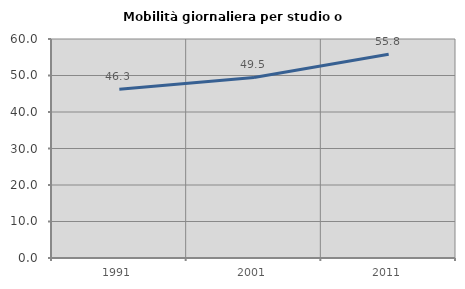
| Category | Mobilità giornaliera per studio o lavoro |
|---|---|
| 1991.0 | 46.254 |
| 2001.0 | 49.469 |
| 2011.0 | 55.808 |